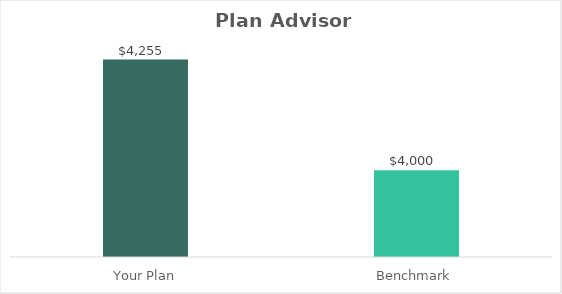
| Category | Series 0 |
|---|---|
| Your Plan | 4255 |
| Benchmark | 4000 |